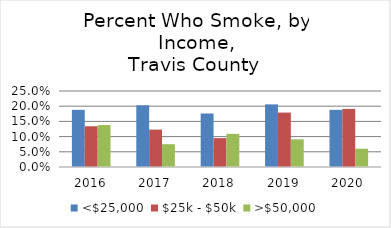
| Category | <$25,000 | $25k - $50k | >$50,000 |
|---|---|---|---|
| 2016.0 | 0.188 | 0.134 | 0.138 |
| 2017.0 | 0.203 | 0.123 | 0.075 |
| 2018.0 | 0.176 | 0.095 | 0.109 |
| 2019.0 | 0.206 | 0.179 | 0.091 |
| 2020.0 | 0.188 | 0.191 | 0.06 |